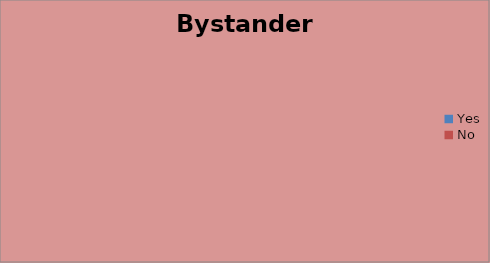
| Category | Bystander CPR |
|---|---|
| Yes | 0 |
| No | 0 |